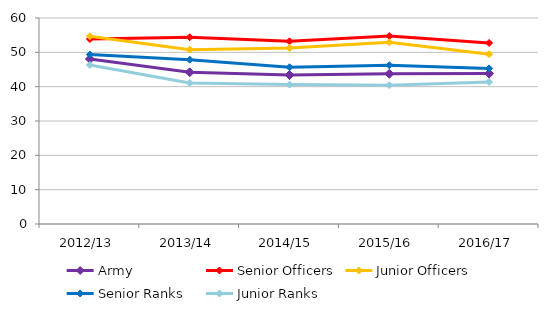
| Category | Army | Senior Officers | Junior Officers | Senior Ranks | Junior Ranks |
|---|---|---|---|---|---|
| 2012/13 | 48.066 | 53.863 | 54.677 | 49.347 | 46.314 |
| 2013/14 | 44.186 | 54.39 | 50.782 | 47.866 | 41.101 |
| 2014/15 | 43.392 | 53.217 | 51.254 | 45.655 | 40.602 |
| 2015/16 | 43.744 | 54.736 | 52.916 | 46.229 | 40.412 |
| 2016/17 | 43.803 | 52.738 | 49.473 | 45.32 | 41.381 |